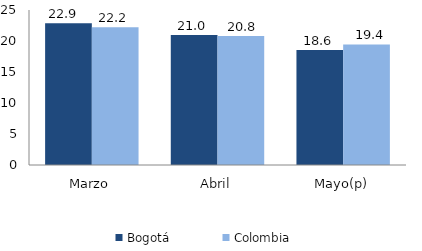
| Category | Bogotá | Colombia |
|---|---|---|
| Marzo | 22.879 | 22.213 |
| Abril | 20.96 | 20.81 |
| Mayo(p) | 18.56 | 19.449 |